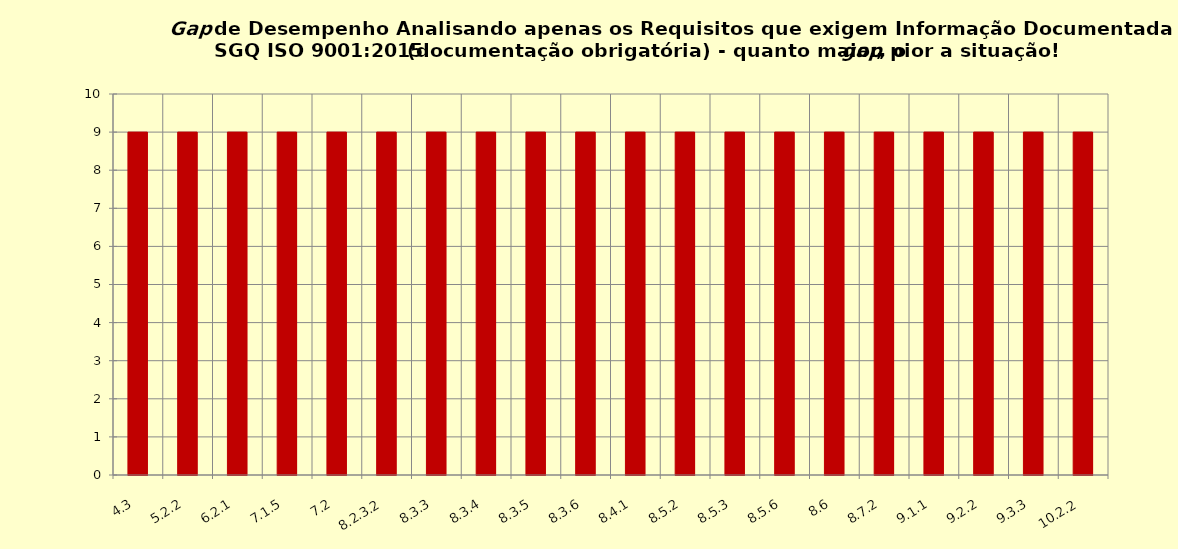
| Category | Gap de Desempenho p/ Requisitos que exigem Informação Documentada do SGQ |
|---|---|
| 4.3 | 9 |
| 5.2.2 | 9 |
| 6.2.1 | 9 |
| 7.1.5 | 9 |
| 7.2 | 9 |
| 8.2.3.2 | 9 |
| 8.3.3 | 9 |
| 8.3.4 | 9 |
| 8.3.5 | 9 |
| 8.3.6 | 9 |
| 8.4.1 | 9 |
| 8.5.2 | 9 |
| 8.5.3 | 9 |
| 8.5.6 | 9 |
| 8.6 | 9 |
| 8.7.2 | 9 |
| 9.1.1 | 9 |
| 9.2.2 | 9 |
| 9.3.3 | 9 |
| 10.2.2 | 9 |